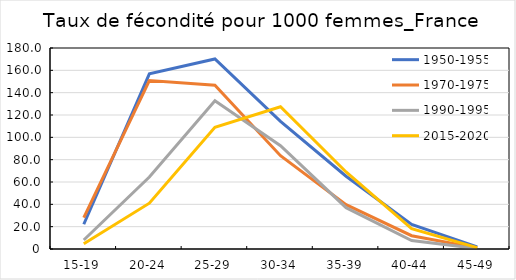
| Category | 1950-1955 | 1970-1975 | 1990-1995 | 2015-2020 |
|---|---|---|---|---|
| 15-19 | 22.183 | 28.154 | 8.038 | 4.727 |
| 20-24 | 156.915 | 150.81 | 64.506 | 41.036 |
| 25-29 | 170.178 | 146.572 | 132.815 | 109.034 |
| 30-34 | 114.362 | 83.58 | 92.484 | 127.334 |
| 35-39 | 65.167 | 39.662 | 37.016 | 68.969 |
| 40-44 | 21.962 | 11.886 | 7.623 | 18.152 |
| 45-49 | 1.873 | 0.956 | 0.418 | 1.208 |